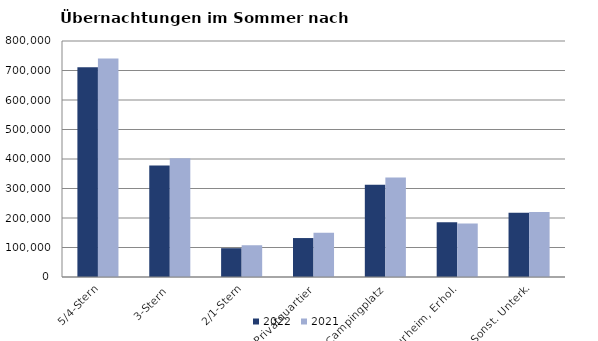
| Category | 2022 | 2021 |
|---|---|---|
| 5/4-Stern | 711294 | 740802 |
| 3-Stern | 377677 | 402716 |
| 2/1-Stern | 97621 | 107662 |
| Privatquartier | 132022 | 149588 |
| Campingplatz | 312978 | 337089 |
| Kurheim, Erhol. | 185315 | 181656 |
| Sonst. Unterk. | 217870 | 220712 |